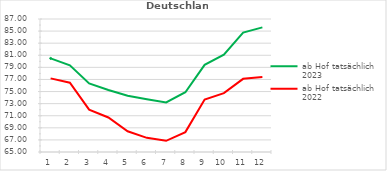
| Category | ab Hof tatsächlich 2023 | ab Hof tatsächlich 2022 |
|---|---|---|
| 0 | 80.484 | 77.178 |
| 1 | 79.327 | 76.455 |
| 2 | 76.333 | 71.997 |
| 3 | 75.264 | 70.708 |
| 4 | 74.298 | 68.43 |
| 5 | 73.718 | 67.339 |
| 6 | 73.203 | 66.849 |
| 7 | 74.892 | 68.289 |
| 8 | 79.421 | 73.686 |
| 9 | 81.112 | 74.744 |
| 10 | 84.756 | 77.104 |
| 11 | 85.609 | 77.389 |